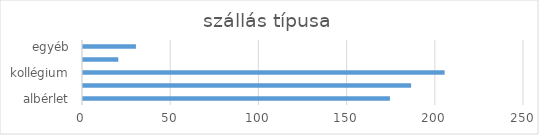
| Category | Series 0 |
|---|---|
| albérlet | 174 |
| bejárós | 186 |
| kollégium | 205 |
| egri | 20 |
| egyéb | 30 |